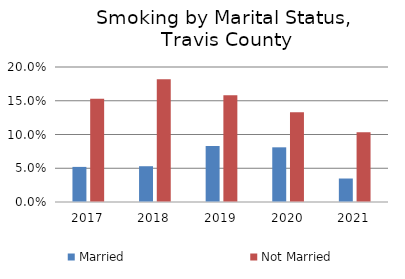
| Category | Married | Not Married |
|---|---|---|
| 2017.0 | 0.052 | 0.153 |
| 2018.0 | 0.053 | 0.182 |
| 2019.0 | 0.083 | 0.158 |
| 2020.0 | 0.081 | 0.133 |
| 2021.0 | 0.035 | 0.103 |